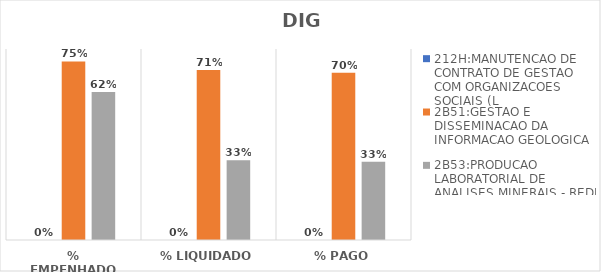
| Category | 212H:MANUTENCAO DE CONTRATO DE GESTAO COM ORGANIZACOES SOCIAIS (L | 2B51:GESTAO E DISSEMINACAO DA INFORMACAO GEOLOGICA | 2B53:PRODUCAO LABORATORIAL DE ANALISES MINERAIS - REDE LAMIN |
|---|---|---|---|
| % EMPENHADO | 0 | 0.748 | 0.62 |
| % LIQUIDADO | 0 | 0.712 | 0.334 |
| % PAGO | 0 | 0.7 | 0.328 |